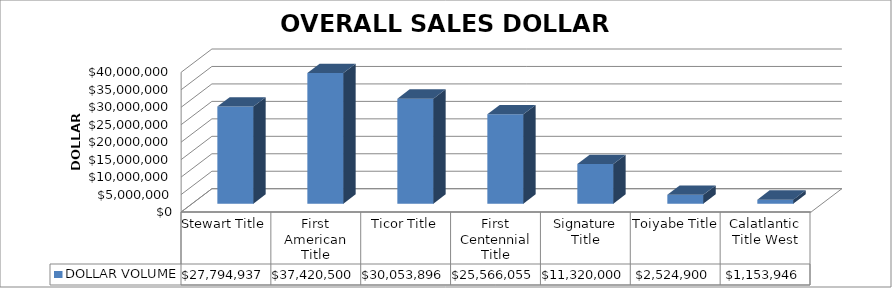
| Category | DOLLAR VOLUME |
|---|---|
| Stewart Title | 27794936.51 |
| First American Title | 37420500 |
| Ticor Title | 30053896.48 |
| First Centennial Title | 25566055 |
| Signature Title | 11320000 |
| Toiyabe Title | 2524900 |
| Calatlantic Title West | 1153946 |